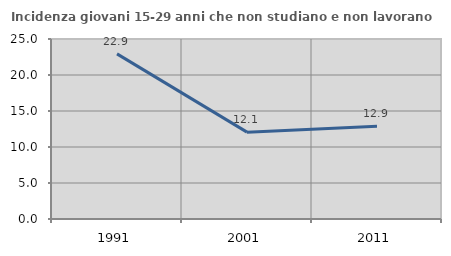
| Category | Incidenza giovani 15-29 anni che non studiano e non lavorano  |
|---|---|
| 1991.0 | 22.932 |
| 2001.0 | 12.065 |
| 2011.0 | 12.883 |